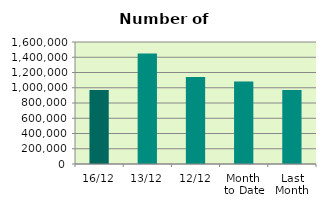
| Category | Series 0 |
|---|---|
| 16/12 | 970164 |
| 13/12 | 1450724 |
| 12/12 | 1140408 |
| Month 
to Date | 1080966.727 |
| Last
Month | 969317.238 |